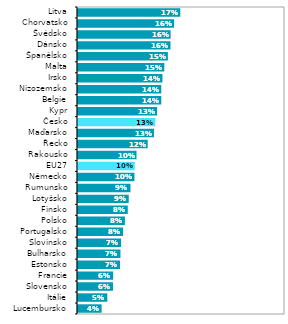
| Category | Series 1 |
|---|---|
| Lucembursko | 0.04 |
| Itálie | 0.05 |
| Slovensko | 0.059 |
| Francie | 0.059 |
| Estonsko | 0.071 |
| Bulharsko | 0.072 |
| Slovinsko | 0.073 |
| Portugalsko | 0.076 |
| Polsko | 0.079 |
| Finsko | 0.084 |
| Lotyšsko | 0.086 |
| Rumunsko | 0.089 |
| Německo | 0.095 |
| EU27 | 0.096 |
| Rakousko | 0.099 |
| Řecko | 0.118 |
| Maďarsko | 0.128 |
| Česko | 0.131 |
| Kypr | 0.134 |
| Belgie | 0.141 |
| Nizozemsko | 0.141 |
| Irsko | 0.143 |
| Malta | 0.146 |
| Španělsko | 0.152 |
| Dánsko | 0.156 |
| Švédsko | 0.157 |
| Chorvatsko | 0.162 |
| Litva | 0.173 |